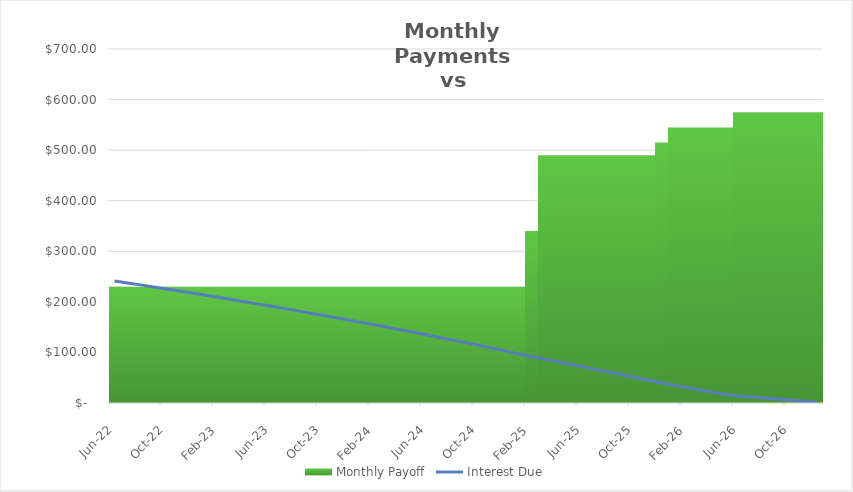
| Category | Monthly Payoff |
|---|---|
| 2022-06-01 | 230 |
| 2022-07-01 | 230 |
| 2022-08-01 | 230 |
| 2022-09-01 | 230 |
| 2022-10-01 | 230 |
| 2022-11-01 | 230 |
| 2022-12-01 | 230 |
| 2023-01-01 | 230 |
| 2023-02-01 | 230 |
| 2023-03-01 | 230 |
| 2023-04-01 | 230 |
| 2023-05-01 | 230 |
| 2023-06-01 | 230 |
| 2023-07-01 | 230 |
| 2023-08-01 | 230 |
| 2023-09-01 | 230 |
| 2023-10-01 | 230 |
| 2023-11-01 | 230 |
| 2023-12-01 | 230 |
| 2024-01-01 | 230 |
| 2024-02-01 | 230 |
| 2024-03-01 | 230 |
| 2024-04-01 | 230 |
| 2024-05-01 | 230 |
| 2024-06-01 | 230 |
| 2024-07-01 | 230 |
| 2024-08-01 | 230 |
| 2024-09-01 | 230 |
| 2024-10-01 | 230 |
| 2024-11-01 | 230 |
| 2024-12-01 | 230 |
| 2025-01-01 | 230 |
| 2025-02-01 | 340 |
| 2025-03-01 | 490 |
| 2025-04-01 | 490 |
| 2025-05-01 | 490 |
| 2025-06-01 | 490 |
| 2025-07-01 | 490 |
| 2025-08-01 | 490 |
| 2025-09-01 | 490 |
| 2025-10-01 | 490 |
| 2025-11-01 | 490 |
| 2025-12-01 | 515.13 |
| 2026-01-01 | 545 |
| 2026-02-01 | 545 |
| 2026-03-01 | 545 |
| 2026-04-01 | 545 |
| 2026-05-01 | 545 |
| 2026-06-01 | 575 |
| 2026-07-01 | 575 |
| 2026-08-01 | 575 |
| 2026-09-01 | 575 |
| 2026-10-01 | 575 |
| 2026-11-01 | 575 |
| 2026-12-01 | 575 |
| #N/A | 0 |
| #N/A | 0 |
| #N/A | 0 |
| #N/A | 0 |
| #N/A | 0 |
| #N/A | 0 |
| #N/A | 0 |
| #N/A | 0 |
| #N/A | 0 |
| #N/A | 0 |
| #N/A | 0 |
| #N/A | 0 |
| #N/A | 0 |
| #N/A | 0 |
| #N/A | 0 |
| #N/A | 0 |
| #N/A | 0 |
| #N/A | 0 |
| #N/A | 0 |
| #N/A | 0 |
| #N/A | 0 |
| #N/A | 0 |
| #N/A | 0 |
| #N/A | 0 |
| #N/A | 0 |
| #N/A | 0 |
| #N/A | 0 |
| #N/A | 0 |
| #N/A | 0 |
| #N/A | 0 |
| #N/A | 0 |
| #N/A | 0 |
| #N/A | 0 |
| #N/A | 0 |
| #N/A | 0 |
| #N/A | 0 |
| #N/A | 0 |
| #N/A | 0 |
| #N/A | 0 |
| #N/A | 0 |
| #N/A | 0 |
| #N/A | 0 |
| #N/A | 0 |
| #N/A | 0 |
| #N/A | 0 |
| #N/A | 0 |
| #N/A | 0 |
| #N/A | 0 |
| #N/A | 0 |
| #N/A | 0 |
| #N/A | 0 |
| #N/A | 0 |
| #N/A | 0 |
| #N/A | 0 |
| #N/A | 0 |
| #N/A | 0 |
| #N/A | 0 |
| #N/A | 0 |
| #N/A | 0 |
| #N/A | 0 |
| #N/A | 0 |
| #N/A | 0 |
| #N/A | 0 |
| #N/A | 0 |
| #N/A | 0 |
| #N/A | 0 |
| #N/A | 0 |
| #N/A | 0 |
| #N/A | 0 |
| #N/A | 0 |
| #N/A | 0 |
| #N/A | 0 |
| #N/A | 0 |
| #N/A | 0 |
| #N/A | 0 |
| #N/A | 0 |
| #N/A | 0 |
| #N/A | 0 |
| #N/A | 0 |
| #N/A | 0 |
| #N/A | 0 |
| #N/A | 0 |
| #N/A | 0 |
| #N/A | 0 |
| #N/A | 0 |
| #N/A | 0 |
| #N/A | 0 |
| #N/A | 0 |
| #N/A | 0 |
| #N/A | 0 |
| #N/A | 0 |
| #N/A | 0 |
| #N/A | 0 |
| #N/A | 0 |
| #N/A | 0 |
| #N/A | 0 |
| #N/A | 0 |
| #N/A | 0 |
| #N/A | 0 |
| #N/A | 0 |
| #N/A | 0 |
| #N/A | 0 |
| #N/A | 0 |
| #N/A | 0 |
| #N/A | 0 |
| #N/A | 0 |
| #N/A | 0 |
| #N/A | 0 |
| #N/A | 0 |
| #N/A | 0 |
| #N/A | 0 |
| #N/A | 0 |
| #N/A | 0 |
| #N/A | 0 |
| #N/A | 0 |
| #N/A | 0 |
| #N/A | 0 |
| #N/A | 0 |
| #N/A | 0 |
| #N/A | 0 |
| #N/A | 0 |
| #N/A | 0 |
| #N/A | 0 |
| #N/A | 0 |
| #N/A | 0 |
| #N/A | 0 |
| #N/A | 0 |
| #N/A | 0 |
| #N/A | 0 |
| #N/A | 0 |
| #N/A | 0 |
| #N/A | 0 |
| #N/A | 0 |
| #N/A | 0 |
| #N/A | 0 |
| #N/A | 0 |
| #N/A | 0 |
| #N/A | 0 |
| #N/A | 0 |
| #N/A | 0 |
| #N/A | 0 |
| #N/A | 0 |
| #N/A | 0 |
| #N/A | 0 |
| #N/A | 0 |
| #N/A | 0 |
| #N/A | 0 |
| #N/A | 0 |
| #N/A | 0 |
| #N/A | 0 |
| #N/A | 0 |
| #N/A | 0 |
| #N/A | 0 |
| #N/A | 0 |
| #N/A | 0 |
| #N/A | 0 |
| #N/A | 0 |
| #N/A | 0 |
| #N/A | 0 |
| #N/A | 0 |
| #N/A | 0 |
| #N/A | 0 |
| #N/A | 0 |
| #N/A | 0 |
| #N/A | 0 |
| #N/A | 0 |
| #N/A | 0 |
| #N/A | 0 |
| #N/A | 0 |
| #N/A | 0 |
| #N/A | 0 |
| #N/A | 0 |
| #N/A | 0 |
| #N/A | 0 |
| #N/A | 0 |
| #N/A | 0 |
| #N/A | 0 |
| #N/A | 0 |
| #N/A | 0 |
| #N/A | 0 |
| #N/A | 0 |
| #N/A | 0 |
| #N/A | 0 |
| #N/A | 0 |
| #N/A | 0 |
| #N/A | 0 |
| #N/A | 0 |
| #N/A | 0 |
| #N/A | 0 |
| #N/A | 0 |
| #N/A | 0 |
| #N/A | 0 |
| #N/A | 0 |
| #N/A | 0 |
| #N/A | 0 |
| #N/A | 0 |
| #N/A | 0 |
| #N/A | 0 |
| #N/A | 0 |
| #N/A | 0 |
| #N/A | 0 |
| #N/A | 0 |
| #N/A | 0 |
| #N/A | 0 |
| #N/A | 0 |
| #N/A | 0 |
| #N/A | 0 |
| #N/A | 0 |
| #N/A | 0 |
| #N/A | 0 |
| #N/A | 0 |
| #N/A | 0 |
| #N/A | 0 |
| #N/A | 0 |
| #N/A | 0 |
| #N/A | 0 |
| #N/A | 0 |
| #N/A | 0 |
| #N/A | 0 |
| #N/A | 0 |
| #N/A | 0 |
| #N/A | 0 |
| #N/A | 0 |
| #N/A | 0 |
| #N/A | 0 |
| #N/A | 0 |
| #N/A | 0 |
| #N/A | 0 |
| #N/A | 0 |
| #N/A | 0 |
| #N/A | 0 |
| #N/A | 0 |
| #N/A | 0 |
| #N/A | 0 |
| #N/A | 0 |
| #N/A | 0 |
| #N/A | 0 |
| #N/A | 0 |
| #N/A | 0 |
| #N/A | 0 |
| #N/A | 0 |
| #N/A | 0 |
| #N/A | 0 |
| #N/A | 0 |
| #N/A | 0 |
| #N/A | 0 |
| #N/A | 0 |
| #N/A | 0 |
| #N/A | 0 |
| #N/A | 0 |
| #N/A | 0 |
| #N/A | 0 |
| #N/A | 0 |
| #N/A | 0 |
| #N/A | 0 |
| #N/A | 0 |
| #N/A | 0 |
| #N/A | 0 |
| #N/A | 0 |
| #N/A | 0 |
| #N/A | 0 |
| #N/A | 0 |
| #N/A | 0 |
| #N/A | 0 |
| #N/A | 0 |
| #N/A | 0 |
| #N/A | 0 |
| #N/A | 0 |
| #N/A | 0 |
| #N/A | 0 |
| #N/A | 0 |
| #N/A | 0 |
| #N/A | 0 |
| #N/A | 0 |
| #N/A | 0 |
| #N/A | 0 |
| #N/A | 0 |
| #N/A | 0 |
| #N/A | 0 |
| #N/A | 0 |
| #N/A | 0 |
| #N/A | 0 |
| #N/A | 0 |
| #N/A | 0 |
| #N/A | 0 |
| #N/A | 0 |
| #N/A | 0 |
| #N/A | 0 |
| #N/A | 0 |
| #N/A | 0 |
| #N/A | 0 |
| #N/A | 0 |
| #N/A | 0 |
| #N/A | 0 |
| #N/A | 0 |
| #N/A | 0 |
| #N/A | 0 |
| #N/A | 0 |
| #N/A | 0 |
| #N/A | 0 |
| #N/A | 0 |
| #N/A | 0 |
| #N/A | 0 |
| #N/A | 0 |
| #N/A | 0 |